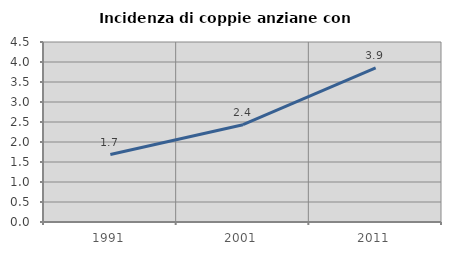
| Category | Incidenza di coppie anziane con figli |
|---|---|
| 1991.0 | 1.686 |
| 2001.0 | 2.433 |
| 2011.0 | 3.853 |